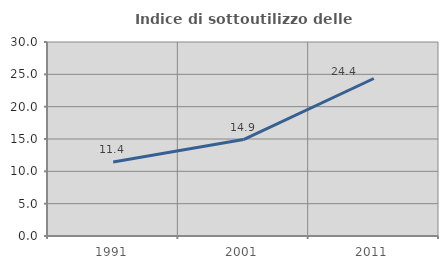
| Category | Indice di sottoutilizzo delle abitazioni  |
|---|---|
| 1991.0 | 11.443 |
| 2001.0 | 14.915 |
| 2011.0 | 24.357 |